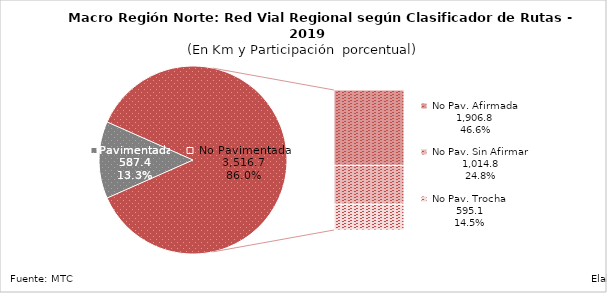
| Category | Series 0 |
|---|---|
| Pavimentada | 587.431 |
| No Pavimentada                   Afirmada | 2065.983 |
| No Pavimentada                   Sin Afirmar | 1065.843 |
| No Pavimentada                            Trocha | 707.141 |